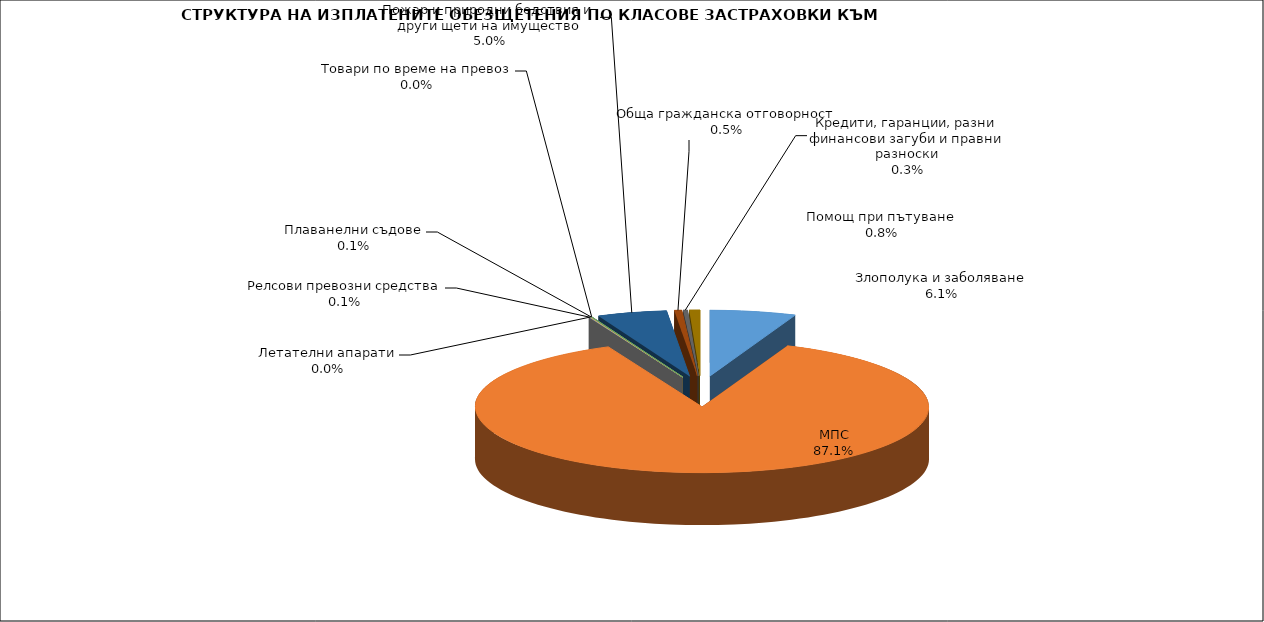
| Category | Series 0 |
|---|---|
| Злополука и заболяване | 0.061 |
| МПС | 0.871 |
| Релсови превозни средства | 0.001 |
| Летателни апарати | 0 |
| Плаванелни съдове | 0.001 |
| Товари по време на превоз | 0 |
| Пожар и природни бедствия и други щети на имущество | 0.05 |
| Обща гражданска отговорност | 0.005 |
| Кредити, гаранции, разни финансови загуби и правни разноски | 0.003 |
| Помощ при пътуване | 0.008 |